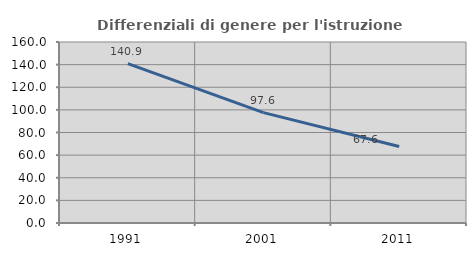
| Category | Differenziali di genere per l'istruzione superiore |
|---|---|
| 1991.0 | 140.88 |
| 2001.0 | 97.591 |
| 2011.0 | 67.638 |